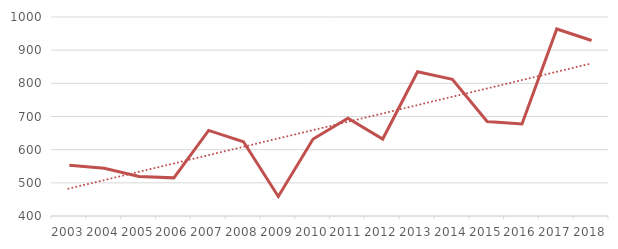
| Category | melk en melkderivaten |
|---|---|
| 2003.0 | 553 |
| 2004.0 | 544 |
| 2005.0 | 519 |
| 2006.0 | 515 |
| 2007.0 | 658 |
| 2008.0 | 624 |
| 2009.0 | 459 |
| 2010.0 | 632 |
| 2011.0 | 695 |
| 2012.0 | 632 |
| 2013.0 | 835 |
| 2014.0 | 812 |
| 2015.0 | 685 |
| 2016.0 | 677.3 |
| 2017.0 | 963.9 |
| 2018.0 | 929.2 |